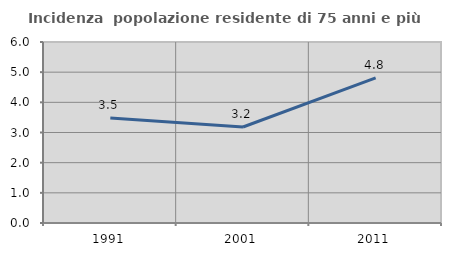
| Category | Incidenza  popolazione residente di 75 anni e più |
|---|---|
| 1991.0 | 3.481 |
| 2001.0 | 3.182 |
| 2011.0 | 4.808 |